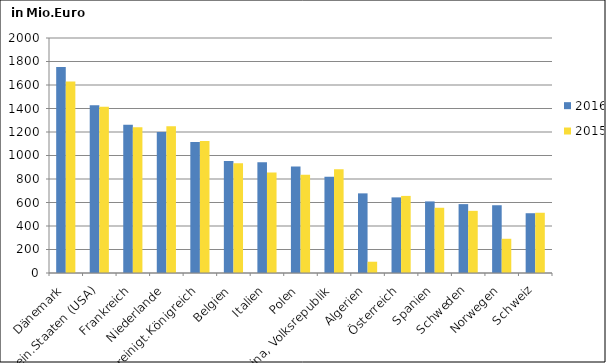
| Category | 2016 | 2015 |
|---|---|---|
| Dänemark | 1752.868 | 1630.075 |
| Verein.Staaten (USA) | 1428.468 | 1415.937 |
| Frankreich | 1261.266 | 1241.459 |
| Niederlande | 1200.548 | 1248.108 |
| Vereinigt.Königreich | 1114.834 | 1123.245 |
| Belgien | 953.079 | 933.372 |
| Italien | 941.564 | 854.484 |
| Polen | 906.124 | 835.96 |
| China, Volksrepublik | 818.817 | 882.492 |
| Algerien | 677.741 | 96.007 |
| Österreich | 643.561 | 656.107 |
| Spanien | 609.177 | 555.19 |
| Schweden | 586.156 | 528.909 |
| Norwegen | 576.682 | 291.166 |
| Schweiz | 508.671 | 512.735 |